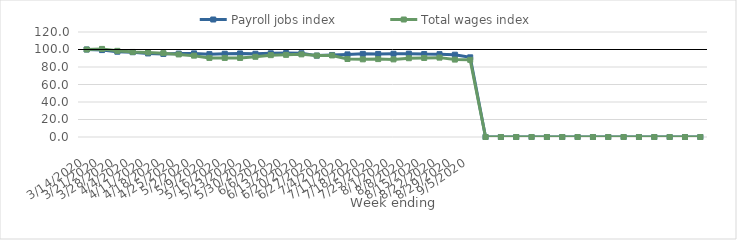
| Category | Payroll jobs index | Total wages index |
|---|---|---|
| 14/03/2020 | 100 | 100 |
| 21/03/2020 | 99.334 | 100.67 |
| 28/03/2020 | 97.468 | 98.457 |
| 04/04/2020 | 96.877 | 97.205 |
| 11/04/2020 | 95.5 | 96.663 |
| 18/04/2020 | 94.911 | 95.842 |
| 25/04/2020 | 95.317 | 94.358 |
| 02/05/2020 | 95.563 | 92.979 |
| 09/05/2020 | 94.702 | 90.368 |
| 16/05/2020 | 95.168 | 90.366 |
| 23/05/2020 | 95.487 | 90.324 |
| 30/05/2020 | 95.142 | 91.677 |
| 06/06/2020 | 95.678 | 93.549 |
| 13/06/2020 | 95.957 | 93.858 |
| 20/06/2020 | 95.71 | 94.446 |
| 27/06/2020 | 93.018 | 93.026 |
| 04/07/2020 | 93.75 | 93.228 |
| 11/07/2020 | 94.408 | 89.131 |
| 18/07/2020 | 95 | 88.756 |
| 25/07/2020 | 94.924 | 89.027 |
| 01/08/2020 | 95.134 | 88.704 |
| 08/08/2020 | 95.262 | 90.036 |
| 15/08/2020 | 94.775 | 90.314 |
| 22/08/2020 | 94.695 | 90.702 |
| 29/08/2020 | 94.056 | 88.481 |
| 05/09/2020 | 91.043 | 88.172 |